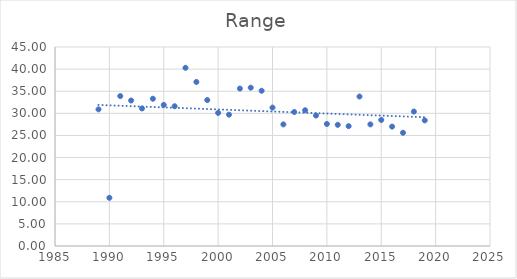
| Category | Range |
|---|---|
| 1989.0 | 30.9 |
| 1990.0 | 10.9 |
| 1991.0 | 33.9 |
| 1992.0 | 32.9 |
| 1993.0 | 31.1 |
| 1994.0 | 33.3 |
| 1995.0 | 31.9 |
| 1996.0 | 31.6 |
| 1997.0 | 40.3 |
| 1998.0 | 37.1 |
| 1999.0 | 33 |
| 2000.0 | 30.1 |
| 2001.0 | 29.7 |
| 2002.0 | 35.6 |
| 2003.0 | 35.8 |
| 2004.0 | 35.1 |
| 2005.0 | 31.3 |
| 2006.0 | 27.5 |
| 2007.0 | 30.3 |
| 2008.0 | 30.7 |
| 2009.0 | 29.5 |
| 2010.0 | 27.6 |
| 2011.0 | 27.4 |
| 2012.0 | 27.1 |
| 2013.0 | 33.8 |
| 2014.0 | 27.5 |
| 2015.0 | 28.5 |
| 2016.0 | 27 |
| 2017.0 | 25.6 |
| 2018.0 | 30.4 |
| 2019.0 | 28.4 |